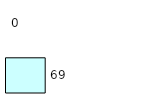
| Category | Series 0 | Series 1 |
|---|---|---|
| 0 | 69 | 0 |